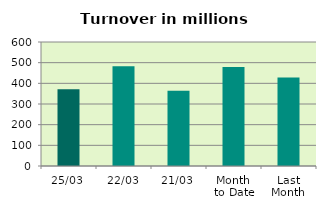
| Category | Series 0 |
|---|---|
| 25/03 | 371.086 |
| 22/03 | 482.957 |
| 21/03 | 364.333 |
| Month 
to Date | 479.478 |
| Last
Month | 428.598 |